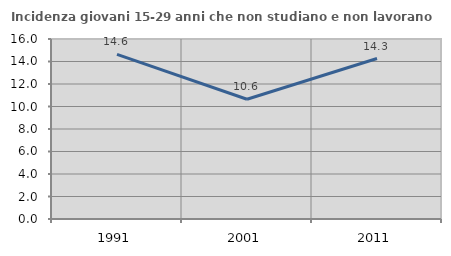
| Category | Incidenza giovani 15-29 anni che non studiano e non lavorano  |
|---|---|
| 1991.0 | 14.634 |
| 2001.0 | 10.642 |
| 2011.0 | 14.266 |